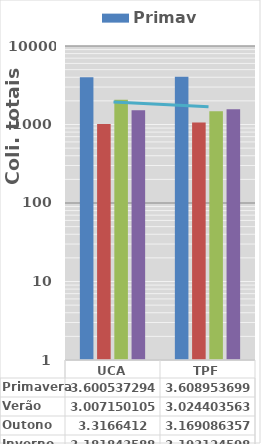
| Category | Primavera | Verão | Outono | Inverno |
|---|---|---|---|---|
| UCA | 3986 | 1016.6 | 2073.2 | 1520 |
| TPF | 4064 | 1057.8 | 1476 | 1560 |